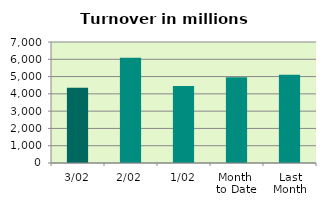
| Category | Series 0 |
|---|---|
| 3/02 | 4350.541 |
| 2/02 | 6089.272 |
| 1/02 | 4460.058 |
| Month 
to Date | 4966.624 |
| Last
Month | 5105.691 |